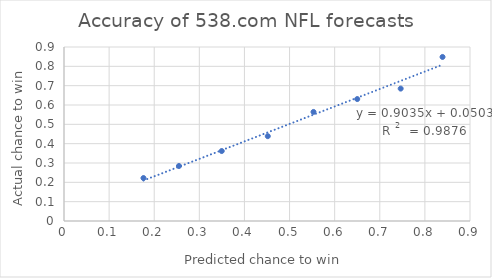
| Category | fraction of wins |
|---|---|
| 0.17616893364668135 | 0.222 |
| 0.25485307578218835 | 0.284 |
| 0.3496425998705703 | 0.362 |
| 0.4517357678588846 | 0.439 |
| 0.5530683522249503 | 0.564 |
| 0.6500186820113645 | 0.631 |
| 0.7463358110607698 | 0.685 |
| 0.8391279449467323 | 0.848 |